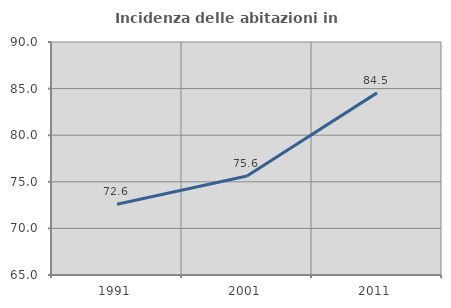
| Category | Incidenza delle abitazioni in proprietà  |
|---|---|
| 1991.0 | 72.586 |
| 2001.0 | 75.623 |
| 2011.0 | 84.54 |